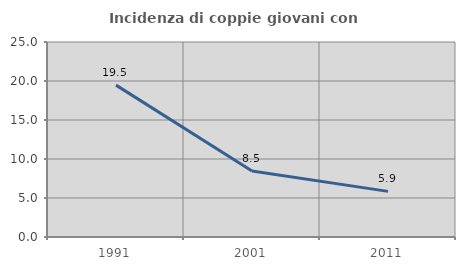
| Category | Incidenza di coppie giovani con figli |
|---|---|
| 1991.0 | 19.469 |
| 2001.0 | 8.451 |
| 2011.0 | 5.851 |